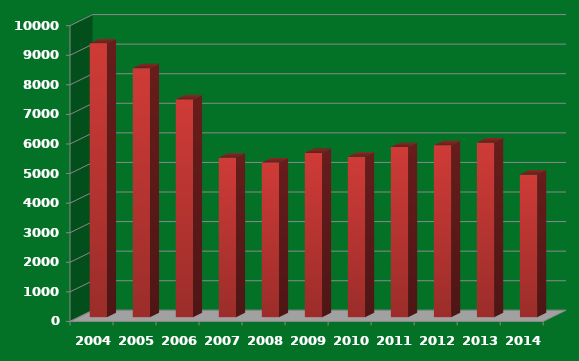
| Category | 2004 2005 2006 2007 2008 2009 2010 2011 2012 2013 2014 |
|---|---|
| 2004.0 | 9261 |
| 2005.0 | 8420 |
| 2006.0 | 7366 |
| 2007.0 | 5397 |
| 2008.0 | 5231 |
| 2009.0 | 5554 |
| 2010.0 | 5426 |
| 2011.0 | 5753 |
| 2012.0 | 5813 |
| 2013.0 | 5907 |
| 2014.0 | 4824 |